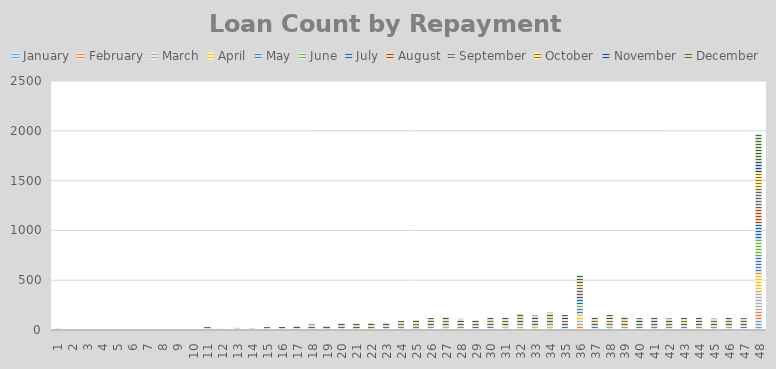
| Category | January | February | March | April | May | June | July | August | September | October | November | December |
|---|---|---|---|---|---|---|---|---|---|---|---|---|
| 1.0 | 1 | 0 | 2 | 1 | 3 | 0 | 1 | 3 | 2 | 2 | 0 | 1 |
| 2.0 | 0 | 0 | 0 | 0 | 1 | 0 | 0 | 0 | 0 | 0 | 0 | 0 |
| 3.0 | 1 | 1 | 0 | 0 | 1 | 1 | 0 | 0 | 0 | 1 | 0 | 1 |
| 4.0 | 0 | 0 | 0 | 0 | 0 | 0 | 1 | 1 | 2 | 0 | 0 | 0 |
| 5.0 | 0 | 0 | 0 | 1 | 0 | 0 | 1 | 0 | 0 | 0 | 0 | 0 |
| 6.0 | 0 | 0 | 0 | 0 | 0 | 0 | 0 | 0 | 0 | 0 | 0 | 0 |
| 7.0 | 0 | 0 | 0 | 0 | 1 | 0 | 0 | 1 | 1 | 0 | 0 | 0 |
| 8.0 | 0 | 0 | 0 | 0 | 0 | 0 | 0 | 0 | 0 | 1 | 1 | 4 |
| 9.0 | 0 | 0 | 0 | 1 | 2 | 0 | 0 | 0 | 0 | 1 | 0 | 0 |
| 10.0 | 3 | 1 | 0 | 1 | 0 | 0 | 0 | 0 | 0 | 0 | 0 | 0 |
| 11.0 | 1 | 1 | 0 | 19 | 1 | 0 | 1 | 0 | 0 | 0 | 2 | 2 |
| 12.0 | 0 | 1 | 0 | 0 | 1 | 0 | 1 | 2 | 3 | 2 | 0 | 4 |
| 13.0 | 4 | 0 | 3 | 1 | 1 | 1 | 4 | 3 | 0 | 0 | 0 | 4 |
| 14.0 | 2 | 0 | 0 | 2 | 0 | 3 | 3 | 1 | 0 | 3 | 1 | 4 |
| 15.0 | 3 | 1 | 1 | 4 | 3 | 4 | 3 | 2 | 1 | 3 | 0 | 3 |
| 16.0 | 1 | 4 | 2 | 2 | 3 | 2 | 5 | 2 | 3 | 2 | 1 | 3 |
| 17.0 | 2 | 2 | 3 | 1 | 4 | 2 | 4 | 2 | 5 | 4 | 5 | 6 |
| 18.0 | 6 | 1 | 5 | 7 | 7 | 6 | 5 | 1 | 6 | 3 | 3 | 6 |
| 19.0 | 2 | 3 | 3 | 3 | 5 | 2 | 7 | 2 | 2 | 6 | 3 | 6 |
| 20.0 | 4 | 5 | 4 | 12 | 6 | 2 | 8 | 2 | 7 | 2 | 7 | 9 |
| 21.0 | 4 | 6 | 2 | 5 | 9 | 3 | 3 | 10 | 7 | 6 | 3 | 9 |
| 22.0 | 5 | 6 | 9 | 1 | 7 | 6 | 7 | 3 | 5 | 11 | 1 | 10 |
| 23.0 | 6 | 7 | 7 | 4 | 8 | 3 | 11 | 6 | 5 | 5 | 4 | 9 |
| 24.0 | 6 | 6 | 8 | 6 | 6 | 7 | 11 | 2 | 10 | 8 | 8 | 12 |
| 25.0 | 3 | 3 | 8 | 5 | 11 | 5 | 12 | 12 | 8 | 16 | 5 | 12 |
| 26.0 | 3 | 9 | 10 | 11 | 19 | 4 | 11 | 5 | 8 | 17 | 10 | 14 |
| 27.0 | 9 | 6 | 11 | 12 | 10 | 7 | 20 | 10 | 7 | 14 | 6 | 18 |
| 28.0 | 9 | 5 | 8 | 12 | 16 | 4 | 13 | 7 | 6 | 10 | 5 | 17 |
| 29.0 | 9 | 5 | 9 | 7 | 10 | 3 | 12 | 13 | 9 | 6 | 6 | 11 |
| 30.0 | 3 | 4 | 11 | 13 | 12 | 12 | 10 | 14 | 9 | 15 | 8 | 14 |
| 31.0 | 10 | 9 | 8 | 13 | 9 | 7 | 15 | 11 | 10 | 15 | 7 | 14 |
| 32.0 | 8 | 5 | 22 | 21 | 16 | 5 | 11 | 13 | 12 | 17 | 16 | 18 |
| 33.0 | 4 | 11 | 12 | 14 | 12 | 6 | 21 | 14 | 14 | 14 | 14 | 9 |
| 34.0 | 10 | 12 | 10 | 13 | 14 | 10 | 18 | 15 | 15 | 21 | 8 | 27 |
| 35.0 | 6 | 6 | 6 | 11 | 13 | 9 | 17 | 15 | 15 | 20 | 15 | 17 |
| 36.0 | 15 | 42 | 54 | 51 | 62 | 48 | 83 | 36 | 60 | 34 | 20 | 45 |
| 37.0 | 3 | 11 | 11 | 5 | 14 | 8 | 14 | 13 | 9 | 13 | 6 | 17 |
| 38.0 | 9 | 8 | 14 | 6 | 19 | 9 | 7 | 12 | 12 | 23 | 7 | 26 |
| 39.0 | 6 | 11 | 12 | 7 | 8 | 13 | 5 | 14 | 12 | 17 | 10 | 20 |
| 40.0 | 7 | 5 | 11 | 8 | 8 | 8 | 5 | 10 | 12 | 12 | 13 | 20 |
| 41.0 | 6 | 8 | 6 | 5 | 10 | 12 | 15 | 11 | 7 | 11 | 13 | 21 |
| 42.0 | 6 | 10 | 10 | 7 | 11 | 6 | 8 | 10 | 7 | 10 | 8 | 23 |
| 43.0 | 5 | 5 | 10 | 12 | 14 | 10 | 10 | 8 | 17 | 16 | 5 | 14 |
| 44.0 | 4 | 14 | 8 | 8 | 9 | 13 | 9 | 7 | 12 | 11 | 10 | 18 |
| 45.0 | 6 | 11 | 12 | 6 | 12 | 12 | 14 | 10 | 8 | 12 | 2 | 9 |
| 46.0 | 8 | 12 | 8 | 9 | 10 | 7 | 15 | 11 | 13 | 9 | 4 | 17 |
| 47.0 | 5 | 6 | 12 | 8 | 18 | 5 | 12 | 10 | 11 | 12 | 7 | 13 |
| 48.0 | 99 | 112 | 196 | 172 | 177 | 158 | 162 | 153 | 199 | 166 | 108 | 265 |